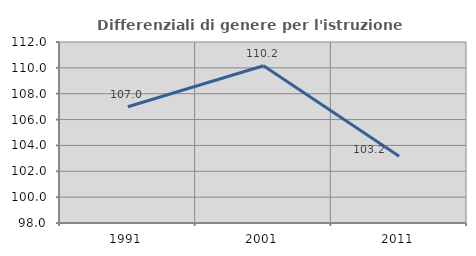
| Category | Differenziali di genere per l'istruzione superiore |
|---|---|
| 1991.0 | 106.993 |
| 2001.0 | 110.159 |
| 2011.0 | 103.154 |